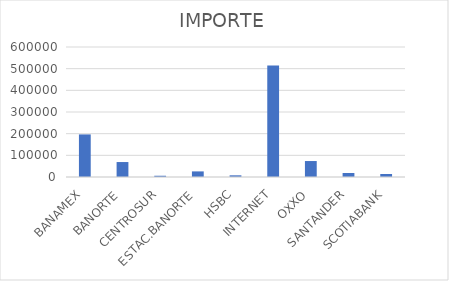
| Category | IMPORTE |
|---|---|
| BANAMEX | 196520.84 |
| BANORTE | 69045.81 |
| CENTROSUR | 5767 |
| ESTAC.BANORTE | 25861.85 |
| HSBC | 7728.24 |
| INTERNET | 514216.13 |
| OXXO | 73691.92 |
| SANTANDER | 18345.65 |
| SCOTIABANK | 13935.33 |